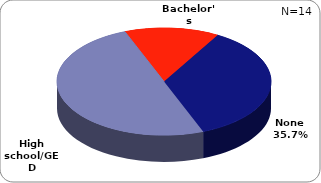
| Category | Series 0 |
|---|---|
| None | 0.357 |
| High school/GED | 0.5 |
| Bachelor's | 0.143 |